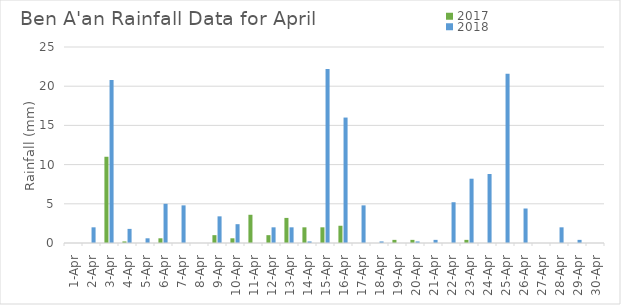
| Category | 2017 | 2018 |
|---|---|---|
| 2017-04-01 | 0 | 0 |
| 2017-04-02 | 0 | 2 |
| 2017-04-03 | 11 | 20.8 |
| 2017-04-04 | 0.2 | 1.8 |
| 2017-04-05 | 0 | 0.6 |
| 2017-04-06 | 0.6 | 5 |
| 2017-04-07 | 0 | 4.8 |
| 2017-04-08 | 0 | 0 |
| 2017-04-09 | 1 | 3.4 |
| 2017-04-10 | 0.6 | 2.4 |
| 2017-04-11 | 3.6 | 0 |
| 2017-04-12 | 1 | 2 |
| 2017-04-13 | 3.2 | 2 |
| 2017-04-14 | 2 | 0.2 |
| 2017-04-15 | 2 | 22.2 |
| 2017-04-16 | 2.2 | 16 |
| 2017-04-17 | 0 | 4.8 |
| 2017-04-18 | 0 | 0.2 |
| 2017-04-19 | 0.4 | 0 |
| 2017-04-20 | 0.4 | 0.2 |
| 2017-04-21 | 0 | 0.4 |
| 2017-04-22 | 0 | 5.2 |
| 2017-04-23 | 0.4 | 8.2 |
| 2017-04-24 | 0 | 8.8 |
| 2017-04-25 | 0 | 21.6 |
| 2017-04-26 | 0 | 4.4 |
| 2017-04-27 | 0 | 0 |
| 2017-04-28 | 0 | 2 |
| 2017-04-29 | 0 | 0.4 |
| 2017-04-30 | 0 | 0 |